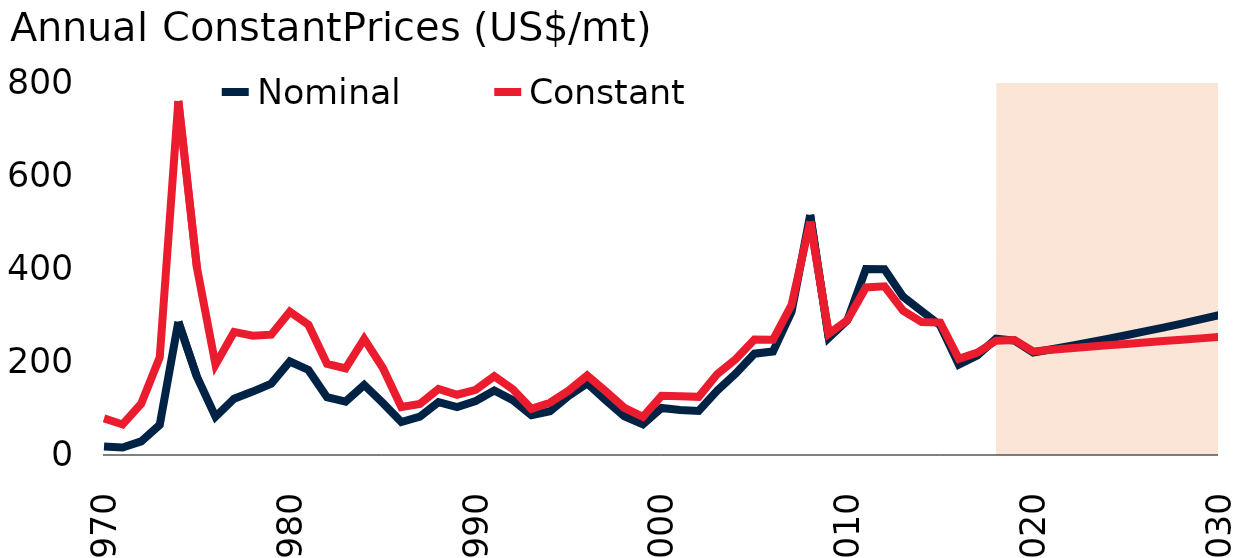
| Category | Nominal | Constant |
|---|---|---|
| 1970.0 | 18.25 | 78.614 |
| 1971.0 | 16 | 65.534 |
| 1972.0 | 29.25 | 109.828 |
| 1973.0 | 64.75 | 209.638 |
| 1974.0 | 285.75 | 759.167 |
| 1975.0 | 168 | 401.887 |
| 1976.0 | 82 | 193.78 |
| 1977.0 | 120.763 | 264.008 |
| 1978.0 | 136.035 | 255.909 |
| 1979.0 | 153.002 | 258.02 |
| 1980.0 | 200.562 | 307.496 |
| 1981.0 | 182.5 | 279.484 |
| 1982.0 | 123.958 | 195.66 |
| 1983.0 | 114.542 | 185.722 |
| 1984.0 | 150.167 | 248.964 |
| 1985.0 | 111.625 | 187.015 |
| 1986.0 | 70.75 | 103.058 |
| 1987.0 | 82.5 | 109.663 |
| 1988.0 | 113.542 | 141.727 |
| 1989.0 | 102.958 | 129.291 |
| 1990.0 | 115.646 | 139.885 |
| 1991.0 | 138.396 | 168.956 |
| 1992.0 | 117.604 | 140.939 |
| 1993.0 | 85.542 | 99.095 |
| 1994.0 | 93.885 | 112.129 |
| 1995.0 | 126.862 | 138.014 |
| 1996.0 | 153.692 | 170.449 |
| 1997.0 | 117.494 | 136.744 |
| 1998.0 | 83.217 | 101.273 |
| 1999.0 | 65.942 | 81.823 |
| 2000.0 | 100.923 | 126.852 |
| 2001.0 | 96.453 | 125.956 |
| 2002.0 | 94.419 | 124.756 |
| 2003.0 | 138.185 | 173.561 |
| 2004.0 | 174.915 | 205.719 |
| 2005.0 | 217.352 | 247.824 |
| 2006.0 | 222.139 | 247.024 |
| 2007.0 | 307.108 | 321.816 |
| 2008.0 | 514.979 | 500.787 |
| 2009.0 | 251.079 | 260.288 |
| 2010.0 | 288.904 | 288.904 |
| 2011.0 | 398.923 | 359.404 |
| 2012.0 | 398.601 | 361.788 |
| 2013.0 | 339.615 | 309.6 |
| 2014.0 | 308.438 | 285.016 |
| 2015.0 | 277.938 | 284.021 |
| 2016.0 | 194.129 | 206.446 |
| 2017.0 | 213.875 | 219.762 |
| 2018.0 | 249.45 | 245.088 |
| 2019.0 | 245.282 | 246.569 |
| 2020.0 | 220 | 222.246 |
| 2021.0 | 226.93 | 225.642 |
| 2022.0 | 234.079 | 228.914 |
| 2023.0 | 241.453 | 232.099 |
| 2024.0 | 249.059 | 235.216 |
| 2025.0 | 256.905 | 238.28 |
| 2026.0 | 264.998 | 241.301 |
| 2027.0 | 273.345 | 244.283 |
| 2028.0 | 281.956 | 247.232 |
| 2029.0 | 290.838 | 250.149 |
| 2030.0 | 300 | 253.037 |